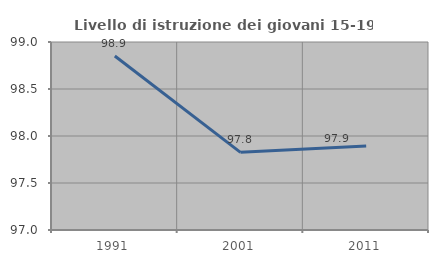
| Category | Livello di istruzione dei giovani 15-19 anni |
|---|---|
| 1991.0 | 98.851 |
| 2001.0 | 97.826 |
| 2011.0 | 97.895 |